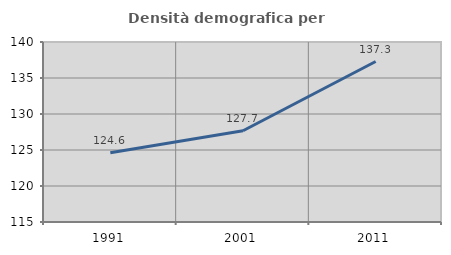
| Category | Densità demografica |
|---|---|
| 1991.0 | 124.613 |
| 2001.0 | 127.675 |
| 2011.0 | 137.288 |